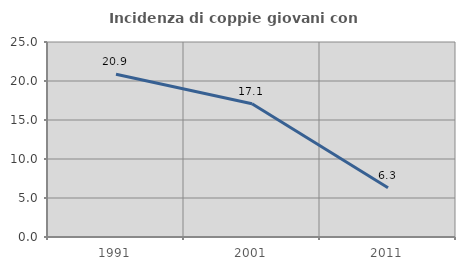
| Category | Incidenza di coppie giovani con figli |
|---|---|
| 1991.0 | 20.863 |
| 2001.0 | 17.079 |
| 2011.0 | 6.327 |